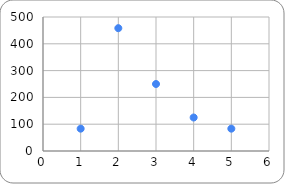
| Category | Pola Distribusi |
|---|---|
| 0 | 83.333 |
| 1 | 458.333 |
| 2 | 250 |
| 3 | 125 |
| 4 | 83.333 |